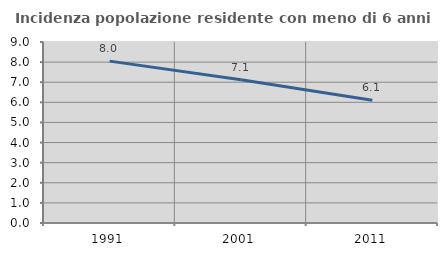
| Category | Incidenza popolazione residente con meno di 6 anni |
|---|---|
| 1991.0 | 8.049 |
| 2001.0 | 7.121 |
| 2011.0 | 6.098 |